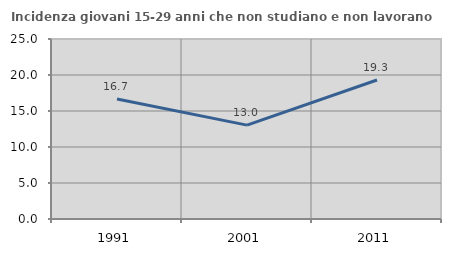
| Category | Incidenza giovani 15-29 anni che non studiano e non lavorano  |
|---|---|
| 1991.0 | 16.667 |
| 2001.0 | 13.034 |
| 2011.0 | 19.302 |